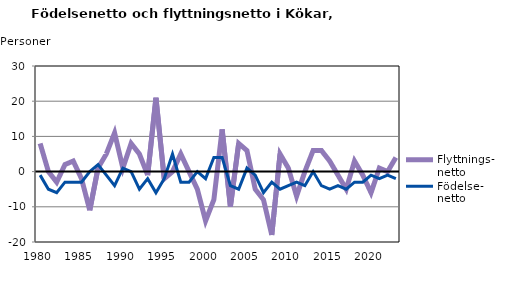
| Category | Flyttnings- netto | Födelse- netto |
|---|---|---|
| 1980.0 | 8 | -1 |
| 1981.0 | 0 | -5 |
| 1982.0 | -3 | -6 |
| 1983.0 | 2 | -3 |
| 1984.0 | 3 | -3 |
| 1985.0 | -2 | -3 |
| 1986.0 | -11 | 0 |
| 1987.0 | 1 | 2 |
| 1988.0 | 5 | -1 |
| 1989.0 | 11 | -4 |
| 1990.0 | 1 | 1 |
| 1991.0 | 8 | 0 |
| 1992.0 | 5 | -5 |
| 1993.0 | -1 | -2 |
| 1994.0 | 21 | -6 |
| 1995.0 | -2 | -2 |
| 1996.0 | 0 | 5 |
| 1997.0 | 5 | -3 |
| 1998.0 | 0 | -3 |
| 1999.0 | -5 | 0 |
| 2000.0 | -14 | -2 |
| 2001.0 | -8 | 4 |
| 2002.0 | 12 | 4 |
| 2003.0 | -10 | -4 |
| 2004.0 | 8 | -5 |
| 2005.0 | 6 | 1 |
| 2006.0 | -5 | -1 |
| 2007.0 | -8 | -6 |
| 2008.0 | -18 | -3 |
| 2009.0 | 5 | -5 |
| 2010.0 | 1 | -4 |
| 2011.0 | -7 | -3 |
| 2012.0 | 0 | -4 |
| 2013.0 | 6 | 0 |
| 2014.0 | 6 | -4 |
| 2015.0 | 3 | -5 |
| 2016.0 | -1 | -4 |
| 2017.0 | -5 | -5 |
| 2018.0 | 3 | -3 |
| 2019.0 | -1 | -3 |
| 2020.0 | -6 | -1 |
| 2021.0 | 1 | -2 |
| 2022.0 | 0 | -1 |
| 2023.0 | 4 | -2 |